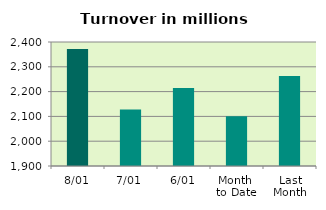
| Category | Series 0 |
|---|---|
| 8/01 | 2372.017 |
| 7/01 | 2128.13 |
| 6/01 | 2214.102 |
| Month 
to Date | 2100.885 |
| Last
Month | 2262.611 |